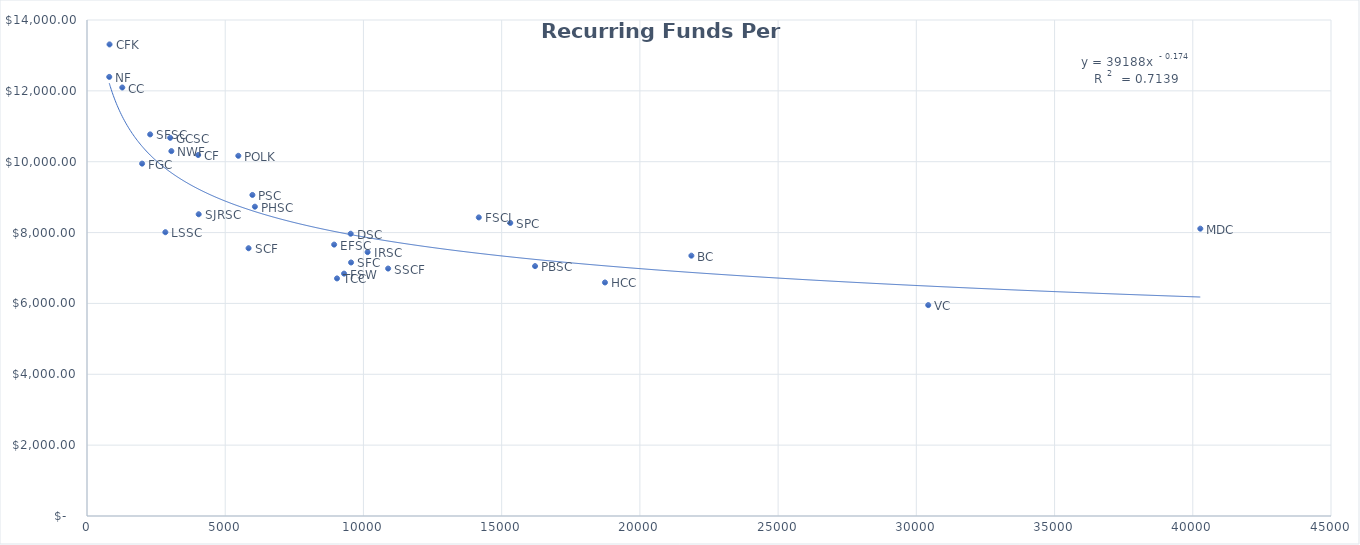
| Category | Funds Per FTE  |
|---|---|
| 804.9 | 12393.671 |
| 815.1 | 13310.487 |
| 1276.4 | 12094.676 |
| 1993.2 | 9945.698 |
| 2284.9 | 10771.117 |
| 2834.2 | 8009.922 |
| 3009.0 | 10674.643 |
| 3051.9 | 10298.785 |
| 4021.1 | 10188.838 |
| 4040.3 | 8517.035 |
| 5473.6 | 10166.524 |
| 5844.3 | 7557.647 |
| 5983.3 | 9061.744 |
| 6073.3 | 8730.234 |
| 8940.3 | 7660.058 |
| 9043.7 | 6705.976 |
| 9298.5 | 6840.98 |
| 9538.7 | 7967.033 |
| 9551.9 | 7155.466 |
| 10150.0 | 7447.722 |
| 10892.9 | 6984.03 |
| 14172.4 | 8427.932 |
| 15311.3 | 8271.849 |
| 16208.1 | 7053.105 |
| 18736.5 | 6591.37 |
| 21862.8 | 7347.872 |
| 30430.4 | 5952.316 |
| 40272.8 | 8110.148 |